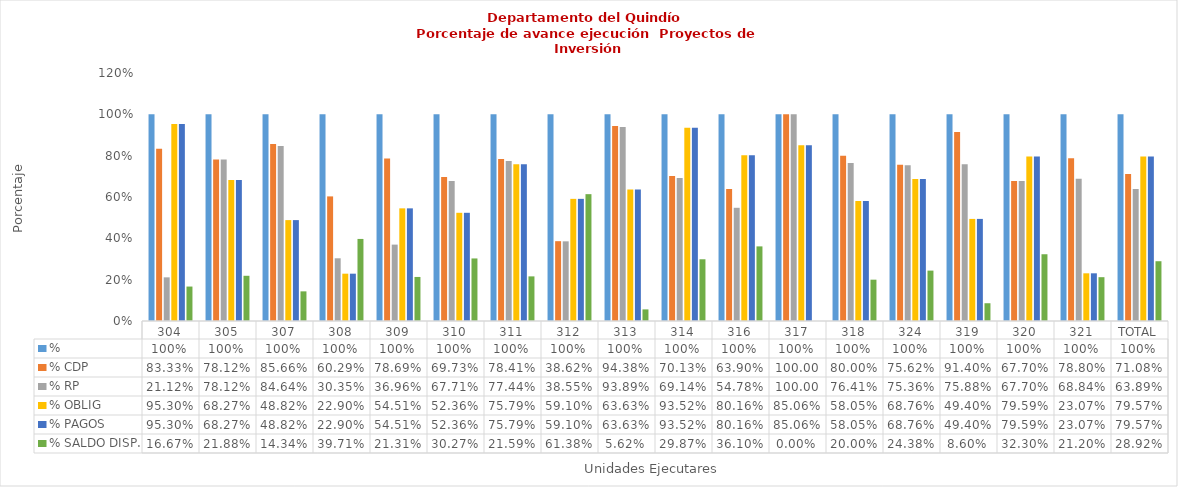
| Category | % | % CDP | % RP | % OBLIG | % PAGOS | % SALDO DISP. |
|---|---|---|---|---|---|---|
| 304 | 1 | 0.833 | 0.211 | 0.953 | 0.953 | 0.167 |
| 305 | 1 | 0.781 | 0.781 | 0.683 | 0.683 | 0.219 |
| 307 | 1 | 0.857 | 0.846 | 0.488 | 0.488 | 0.143 |
| 308 | 1 | 0.603 | 0.303 | 0.229 | 0.229 | 0.397 |
| 309 | 1 | 0.787 | 0.37 | 0.545 | 0.545 | 0.213 |
| 310 | 1 | 0.697 | 0.677 | 0.524 | 0.524 | 0.303 |
| 311 | 1 | 0.784 | 0.774 | 0.758 | 0.758 | 0.216 |
| 312 | 1 | 0.386 | 0.385 | 0.591 | 0.591 | 0.614 |
| 313 | 1 | 0.944 | 0.939 | 0.636 | 0.636 | 0.056 |
| 314 | 1 | 0.701 | 0.691 | 0.935 | 0.935 | 0.299 |
| 316 | 1 | 0.639 | 0.548 | 0.802 | 0.802 | 0.361 |
| 317 | 1 | 1 | 1 | 0.851 | 0.851 | 0 |
| 318 | 1 | 0.8 | 0.764 | 0.581 | 0.581 | 0.2 |
| 324 | 1 | 0.756 | 0.754 | 0.688 | 0.688 | 0.244 |
| 319 | 1 | 0.914 | 0.759 | 0.494 | 0.494 | 0.086 |
| 320 | 1 | 0.677 | 0.677 | 0.796 | 0.796 | 0.323 |
| 321 | 1 | 0.788 | 0.688 | 0.231 | 0.231 | 0.212 |
| TOTAL | 1 | 0.711 | 0.639 | 0.796 | 0.796 | 0.289 |